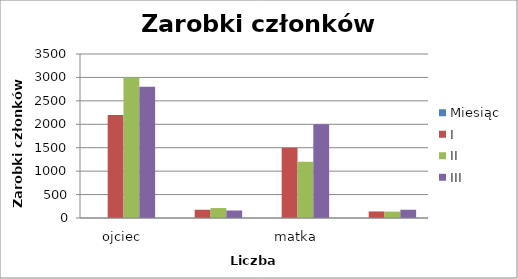
| Category | Miesiąc | I | II | III |
|---|---|---|---|---|
| ojciec | 0 | 2200 | 3000 | 2800 |
|  | 0 | 176 | 212 | 160 |
| matka | 0 | 1500 | 1200 | 2000 |